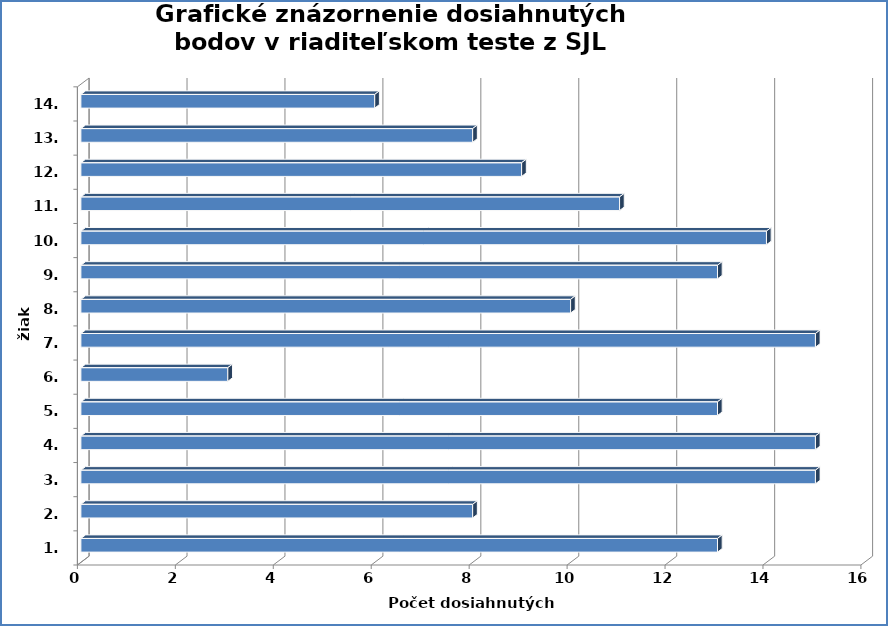
| Category | Series 0 |
|---|---|
| 1. | 13 |
| 2. | 8 |
| 3. | 15 |
| 4. | 15 |
| 5. | 13 |
| 6. | 3 |
| 7. | 15 |
| 8. | 10 |
| 9. | 13 |
| 10. | 14 |
| 11. | 11 |
| 12. | 9 |
| 13. | 8 |
| 14. | 6 |